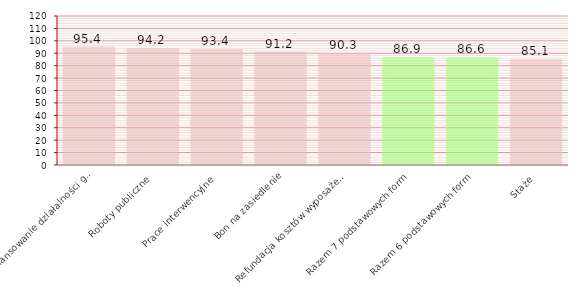
| Category | Efektywność |
|---|---|
| Dofinansowanie działalności gospodarczej | 95.396 |
| Roboty publiczne | 94.236 |
| Prace interwencyjne | 93.357 |
| Bon na zasiedlenie | 91.209 |
| Refundacja kosztów wyposażenia lub doposażenia miejsca pracy | 90.288 |
| Razem 7 podstawowych form | 86.886 |
| Razem 6 podstawowych form | 86.647 |
| Staże | 85.072 |